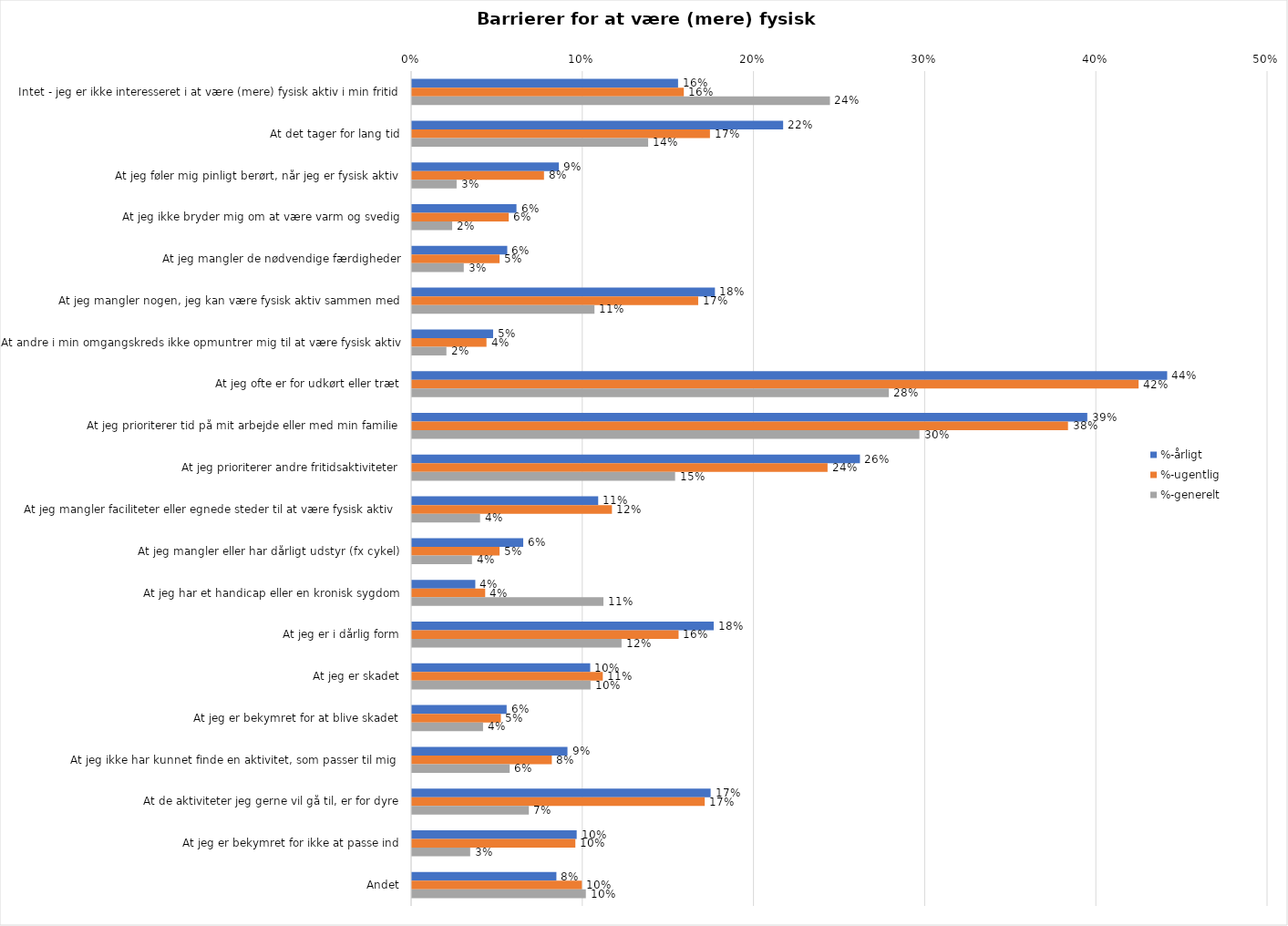
| Category | %-årligt | %-ugentlig | %-generelt |
|---|---|---|---|
| Intet - jeg er ikke interesseret i at være (mere) fysisk aktiv i min fritid | 0.155 | 0.159 | 0.244 |
| At det tager for lang tid | 0.217 | 0.174 | 0.138 |
| At jeg føler mig pinligt berørt, når jeg er fysisk aktiv | 0.086 | 0.077 | 0.026 |
| At jeg ikke bryder mig om at være varm og svedig | 0.061 | 0.056 | 0.023 |
| At jeg mangler de nødvendige færdigheder | 0.056 | 0.051 | 0.03 |
| At jeg mangler nogen, jeg kan være fysisk aktiv sammen med | 0.177 | 0.167 | 0.107 |
| At andre i min omgangskreds ikke opmuntrer mig til at være fysisk aktiv | 0.047 | 0.044 | 0.02 |
| At jeg ofte er for udkørt eller træt | 0.441 | 0.424 | 0.279 |
| At jeg prioriterer tid på mit arbejde eller med min familie | 0.394 | 0.383 | 0.296 |
| At jeg prioriterer andre fritidsaktiviteter | 0.262 | 0.243 | 0.154 |
| At jeg mangler faciliteter eller egnede steder til at være fysisk aktiv  | 0.109 | 0.117 | 0.04 |
| At jeg mangler eller har dårligt udstyr (fx cykel) | 0.065 | 0.051 | 0.035 |
| At jeg har et handicap eller en kronisk sygdom | 0.037 | 0.043 | 0.112 |
| At jeg er i dårlig form | 0.176 | 0.156 | 0.122 |
| At jeg er skadet | 0.104 | 0.111 | 0.104 |
| At jeg er bekymret for at blive skadet | 0.055 | 0.052 | 0.041 |
| At jeg ikke har kunnet finde en aktivitet, som passer til mig  | 0.091 | 0.082 | 0.057 |
| At de aktiviteter jeg gerne vil gå til, er for dyre | 0.174 | 0.171 | 0.068 |
| At jeg er bekymret for ikke at passe ind | 0.096 | 0.095 | 0.034 |
| Andet | 0.084 | 0.099 | 0.102 |